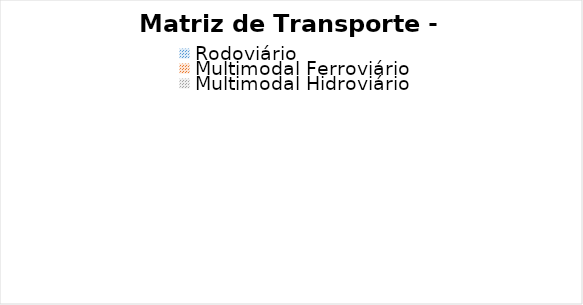
| Category | Matriz de Transporte - MS |
|---|---|
| Rodoviário | 0 |
| Multimodal Ferroviário | 0 |
| Multimodal Hidroviário | 0 |